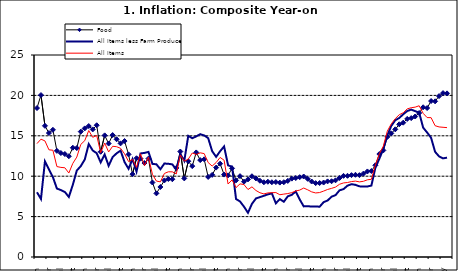
| Category | Food | All Items less Farm Produce | All Items |
|---|---|---|---|
| 09-Jan | 18.436 | 8.013 | 14.034 |
| Feb | 20.041 | 7.178 | 14.584 |
| Mar | 16.233 | 11.842 | 14.366 |
| Apr | 15.342 | 10.85 | 13.268 |
| May | 15.74 | 9.88 | 13.212 |
| June | 13.138 | 8.472 | 11.194 |
| Jul | 12.867 | 8.285 | 11.09 |
| Aug | 12.746 | 8.044 | 11.046 |
| Sep | 12.472 | 7.431 | 10.39 |
| Oct | 13.524 | 8.933 | 11.588 |
| Nov | 13.482 | 10.702 | 12.368 |
| Dec | 15.518 | 11.249 | 13.93 |
| 10-Jan | 15.918 | 12.063 | 14.398 |
| Feb | 16.208 | 13.978 | 15.649 |
| Mar | 15.79 | 13.184 | 14.812 |
| Apr | 16.306 | 12.844 | 15.044 |
| May | 13.023 | 11.711 | 12.915 |
| Jun | 15.053 | 12.686 | 14.099 |
| Jul | 14.043 | 11.287 | 13.002 |
| Aug | 15.09 | 12.366 | 13.702 |
| Sep | 14.57 | 12.83 | 13.65 |
| Oct | 14.065 | 13.168 | 13.45 |
| Nov | 14.351 | 11.746 | 12.766 |
| Dec | 12.701 | 10.917 | 11.815 |
| 11-Jan | 10.255 | 12.118 | 12.08 |
| Feb | 12.221 | 10.569 | 11.1 |
| Mar | 12.169 | 12.815 | 12.779 |
| Apr | 11.629 | 12.882 | 11.291 |
| May | 12.179 | 13.006 | 12.352 |
| Jun | 9.22 | 11.524 | 10.23 |
| Jul | 7.877 | 11.472 | 9.397 |
| Aug | 8.665 | 10.863 | 9.301 |
| Sep | 9.479 | 11.567 | 10.339 |
| Oct | 9.656 | 11.539 | 10.544 |
| Nov | 9.623 | 11.459 | 10.54 |
| Dec | 11.02 | 10.822 | 10.283 |
| 12-Jan | 13.053 | 12.748 | 12.626 |
| 12-Feb | 9.729 | 11.901 | 11.866 |
| 12-Mar | 11.848 | 14.995 | 12.111 |
| Apr | 11.246 | 14.703 | 12.866 |
| May | 12.942 | 14.926 | 12.688 |
| Jun | 11.991 | 15.199 | 12.892 |
| Jul | 12.093 | 15.045 | 12.797 |
| Aug | 9.91 | 14.714 | 11.689 |
| Sep | 10.164 | 13.101 | 11.253 |
| Oct | 11.064 | 12.398 | 11.693 |
| Nov | 11.553 | 13.092 | 12.32 |
| Dec | 10.199 | 13.685 | 11.981 |
| 13-Jan | 10.106 | 11.342 | 9.031 |
| Feb | 10.973 | 11.184 | 9.542 |
| Mar | 9.482 | 7.179 | 8.593 |
| Apr | 10.006 | 6.874 | 9.052 |
| May | 9.321 | 6.227 | 8.964 |
| Jun | 9.606 | 5.472 | 8.353 |
| Jul | 9.994 | 6.58 | 8.682 |
| Aug | 9.723 | 7.245 | 8.231 |
| Sep | 9.437 | 7.41 | 7.952 |
| Oct | 9.249 | 7.579 | 7.807 |
| Nov | 9.313 | 7.75 | 7.931 |
| Dec | 9.253 | 7.872 | 7.957 |
| 14-Jan | 9.271 | 6.648 | 7.977 |
| Feb | 9.207 | 7.166 | 7.707 |
| Mar | 9.254 | 6.836 | 7.783 |
| Apr | 9.414 | 7.508 | 7.851 |
| May | 9.698 | 7.693 | 7.965 |
| Jun | 9.776 | 8.122 | 8.167 |
| Jul | 9.878 | 7.116 | 8.281 |
| Aug | 9.959 | 6.264 | 8.534 |
| Sep | 9.676 | 6.278 | 8.317 |
| Oct | 9.343 | 6.252 | 8.06 |
| Nov | 9.144 | 6.255 | 7.927 |
| Dec | 9.152 | 6.225 | 7.978 |
| 15-Jan | 9.215 | 6.787 | 8.157 |
| Feb | 9.359 | 6.994 | 8.359 |
| Mar | 9.376 | 7.46 | 8.494 |
| Apr | 9.49 | 7.661 | 8.655 |
| May | 9.782 | 8.253 | 9.003 |
| Jun | 10.041 | 8.403 | 9.168 |
| Jul | 10.049 | 8.83 | 9.218 |
| Aug | 10.131 | 9.01 | 9.336 |
| Sep | 10.174 | 8.928 | 9.394 |
| Oct | 10.129 | 8.742 | 9.296 |
| Nov | 10.321 | 8.732 | 9.368 |
| Dec | 10.588 | 8.727 | 9.554 |
| 16-Jan | 10.642 | 8.841 | 9.617 |
| Feb | 11.348 | 11.041 | 11.379 |
| Mar | 12.745 | 12.17 | 12.775 |
| Apr | 13.194 | 13.352 | 13.721 |
| May | 14.861 | 15.054 | 15.577 |
| Jun | 15.302 | 16.224 | 16.48 |
| Jul | 15.799 | 16.929 | 17.127 |
| Aug | 16.427 | 17.208 | 17.609 |
| Sep | 16.622 | 17.666 | 17.852 |
| Oct | 17.09 | 18.067 | 18.33 |
| Nov | 17.191 | 18.241 | 18.476 |
| Dec | 17.388 | 18.052 | 18.547 |
| 17-Jan | 17.818 | 17.867 | 18.719 |
| Feb | 18.528 | 16.011 | 17.78 |
| Mar | 18.436 | 15.404 | 17.256 |
| Apr | 19.303 | 14.75 | 17.244 |
| May | 19.266 | 13.016 | 16.251 |
| June | 19.915 | 12.455 | 16.098 |
| July | 20.284 | 12.207 | 16.053 |
| August | 20.251 | 12.296 | 16.012 |